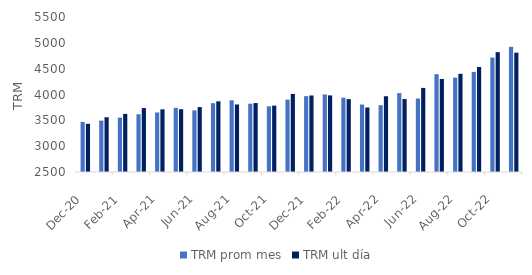
| Category | TRM prom mes | TRM ult día |
|---|---|---|
| 2020-12-01 | 3468.5 | 3432.5 |
| 2021-01-01 | 3494.53 | 3559.46 |
| 2021-02-01 | 3552.43 | 3624.39 |
| 2021-03-01 | 3617 | 3736.91 |
| 2021-04-01 | 3651.85 | 3712.89 |
| 2021-05-01 | 3741.96 | 3715.28 |
| 2021-06-01 | 3693 | 3756.67 |
| 2021-07-01 | 3832.24 | 3867.88 |
| 2021-08-01 | 3887.68 | 3806.87 |
| 2021-09-01 | 3821.54 | 3834.68 |
| 2021-10-01 | 3771.68 | 3784.44 |
| 2021-11-01 | 3900.51 | 4010.98 |
| 2021-12-01 | 3967.77 | 3981.16 |
| 2022-01-01 | 4000.72 | 3982.6 |
| 2022-02-01 | 3938.36 | 3910.64 |
| 2022-03-01 | 3805.52 | 3748.15 |
| 2022-04-01 | 3792.98 | 3966.27 |
| 2022-05-01 | 4027.6 | 3912.34 |
| 2022-06-01 | 3922.5 | 4127.47 |
| 2022-07-01 | 4394.01 | 4300.3 |
| 2022-08-01 | 4326.77 | 4400.16 |
| 2022-09-01 | 4437.31 | 4532.07 |
| 2022-10-01 | 4714.96 | 4819.42 |
| 2022-11-01 | 4922.3 | 4809.51 |